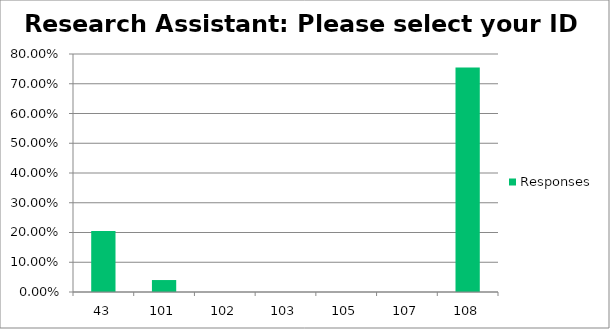
| Category | Responses |
|---|---|
| 43 | 0.205 |
| 101 | 0.04 |
| 102 | 0 |
| 103 | 0 |
| 105 | 0 |
| 107 | 0 |
| 108 | 0.755 |